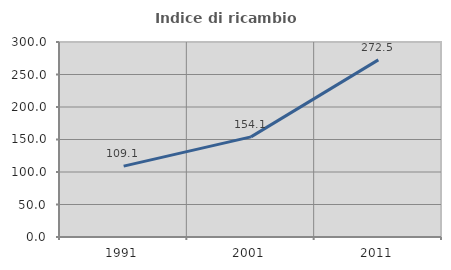
| Category | Indice di ricambio occupazionale  |
|---|---|
| 1991.0 | 109.091 |
| 2001.0 | 154.054 |
| 2011.0 | 272.527 |